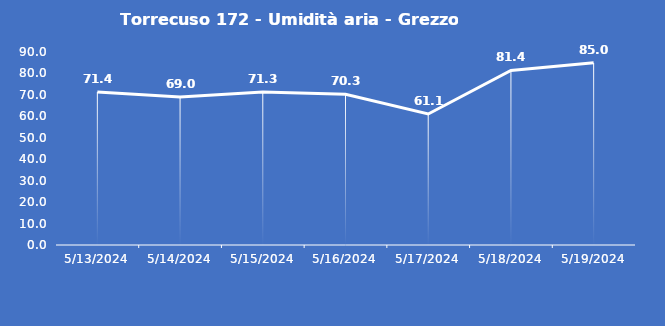
| Category | Torrecuso 172 - Umidità aria - Grezzo (%) |
|---|---|
| 5/13/24 | 71.4 |
| 5/14/24 | 69 |
| 5/15/24 | 71.3 |
| 5/16/24 | 70.3 |
| 5/17/24 | 61.1 |
| 5/18/24 | 81.4 |
| 5/19/24 | 85 |